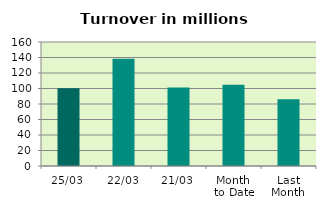
| Category | Series 0 |
|---|---|
| 25/03 | 100.232 |
| 22/03 | 138.348 |
| 21/03 | 101.308 |
| Month 
to Date | 104.76 |
| Last
Month | 86.247 |